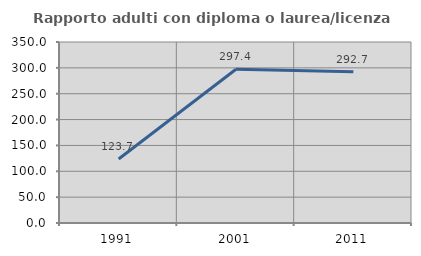
| Category | Rapporto adulti con diploma o laurea/licenza media  |
|---|---|
| 1991.0 | 123.711 |
| 2001.0 | 297.368 |
| 2011.0 | 292.67 |